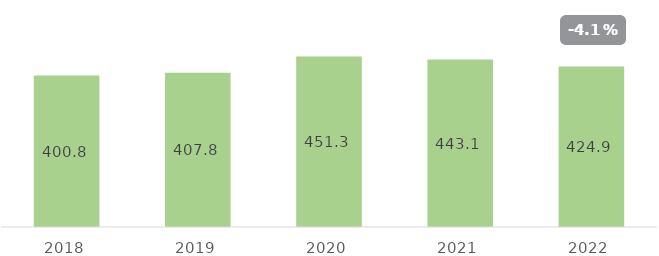
| Category | Menge |
|---|---|
| 2018.0 | 400.845 |
| 2019.0 | 407.764 |
| 2020.0 | 451.338 |
| 2021.0 | 443.127 |
| 2022.0 | 424.858 |